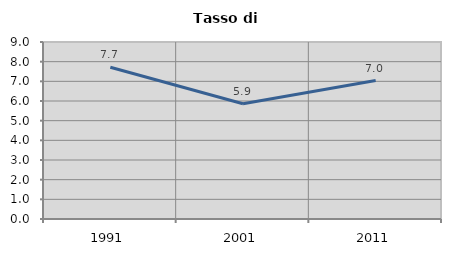
| Category | Tasso di disoccupazione   |
|---|---|
| 1991.0 | 7.72 |
| 2001.0 | 5.861 |
| 2011.0 | 7.042 |